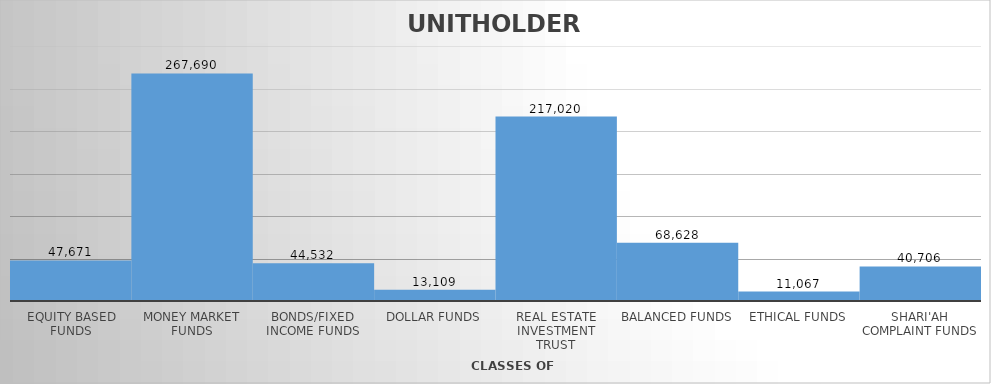
| Category | UNIT HOLDERS |
|---|---|
| EQUITY BASED FUNDS | 47671 |
| MONEY MARKET FUNDS | 267690 |
| BONDS/FIXED INCOME FUNDS | 44532 |
| DOLLAR FUNDS | 13109 |
| REAL ESTATE INVESTMENT TRUST | 217020 |
| BALANCED FUNDS | 68628 |
| ETHICAL FUNDS | 11067 |
| SHARI'AH COMPLAINT FUNDS | 40706 |